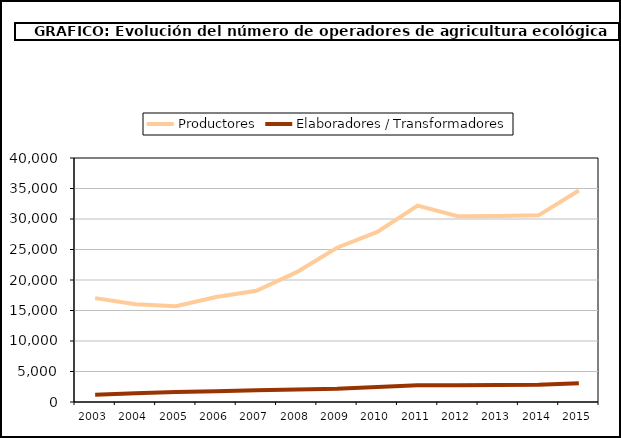
| Category | Productores | Elaboradores / Transformadores |
|---|---|---|
| 2003.0 | 17028 | 1204 |
| 2004.0 | 16013 | 1439 |
| 2005.0 | 15693 | 1635 |
| 2006.0 | 17214 | 1764 |
| 2007.0 | 18226 | 1942 |
| 2008.0 | 21291 | 2061 |
| 2009.0 | 25291 | 2168 |
| 2010.0 | 27877 | 2465 |
| 2011.0 | 32206 | 2747 |
| 2012.0 | 30462 | 2729 |
| 2013.0 | 30502 | 2790 |
| 2014.0 | 30602 | 2842 |
| 2015.0 | 34673 | 3082 |